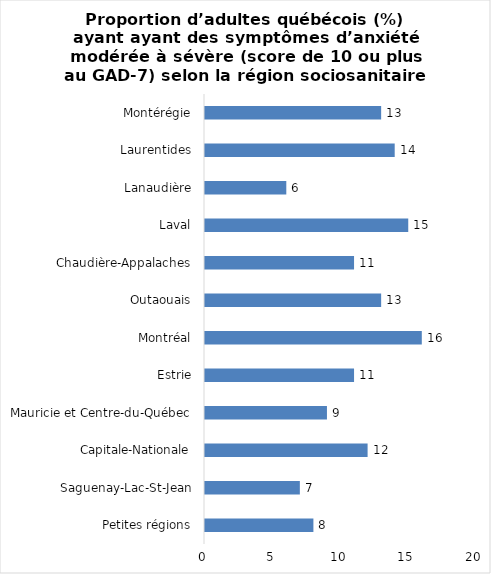
| Category | Series 0 |
|---|---|
| Petites régions | 8 |
| Saguenay-Lac-St-Jean | 7 |
| Capitale-Nationale | 12 |
| Mauricie et Centre-du-Québec | 9 |
| Estrie | 11 |
| Montréal | 16 |
| Outaouais | 13 |
| Chaudière-Appalaches | 11 |
| Laval | 15 |
| Lanaudière | 6 |
| Laurentides | 14 |
| Montérégie | 13 |